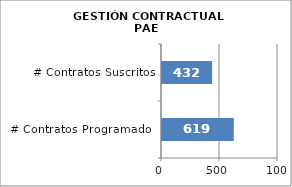
| Category | GESTIÓN CONTRACTUAL PAE |
|---|---|
| # Contratos Programados | 619 |
| # Contratos Suscritos | 432 |